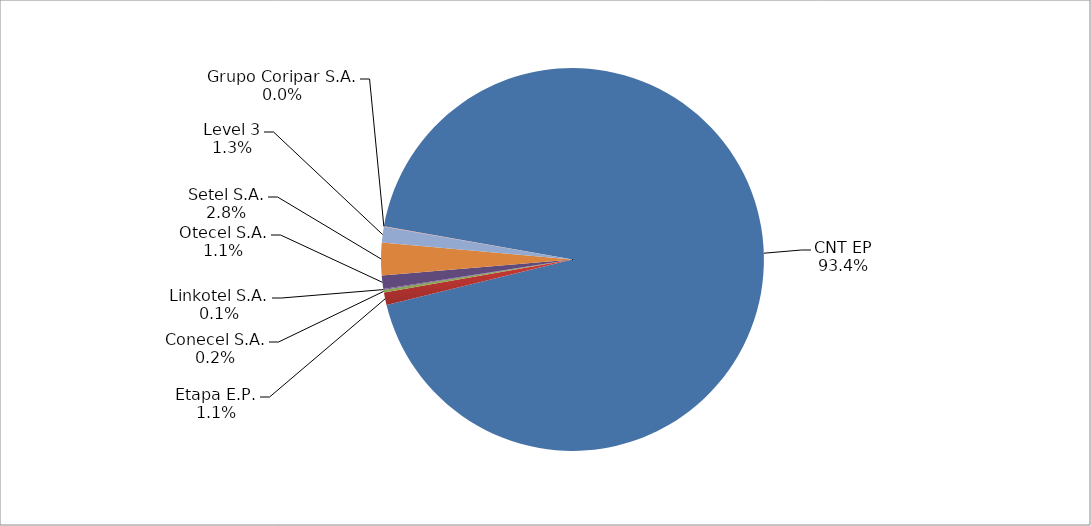
| Category | Series 0 |
|---|---|
| CNT EP | 2207 |
| Etapa E.P. | 25 |
| Conecel S.A. | 5 |
| Linkotel S.A. | 2 |
| Otecel S.A. | 27 |
| Setel S.A. | 65 |
| Level 3 | 31 |
| Grupo Coripar S.A. | 1 |